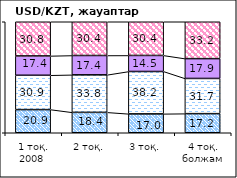
| Category | повысится | не изменится | снизится | не знаю |
|---|---|---|---|---|
| 1 тоқ. 2008  | 20.87 | 30.92 | 17.42 | 30.79 |
| 2 тоқ. | 18.38 | 33.8 | 17.42 | 30.4 |
| 3 тоқ. | 17.01 | 38.18 | 14.46 | 30.35 |
| 4 тоқ. болжам | 17.21 | 31.71 | 17.87 | 33.21 |